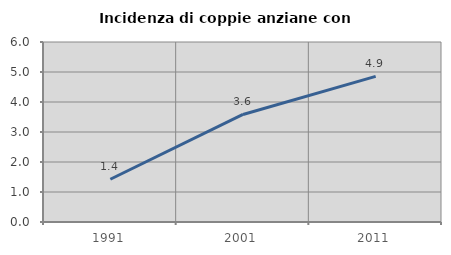
| Category | Incidenza di coppie anziane con figli |
|---|---|
| 1991.0 | 1.425 |
| 2001.0 | 3.585 |
| 2011.0 | 4.855 |